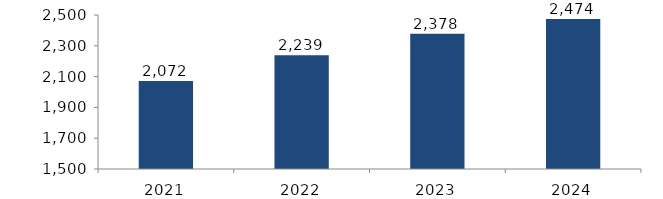
| Category | Bogotá |
|---|---|
| 2021.0 | 2072.162 |
| 2022.0 | 2239.073 |
| 2023.0 | 2377.765 |
| 2024.0 | 2474.168 |